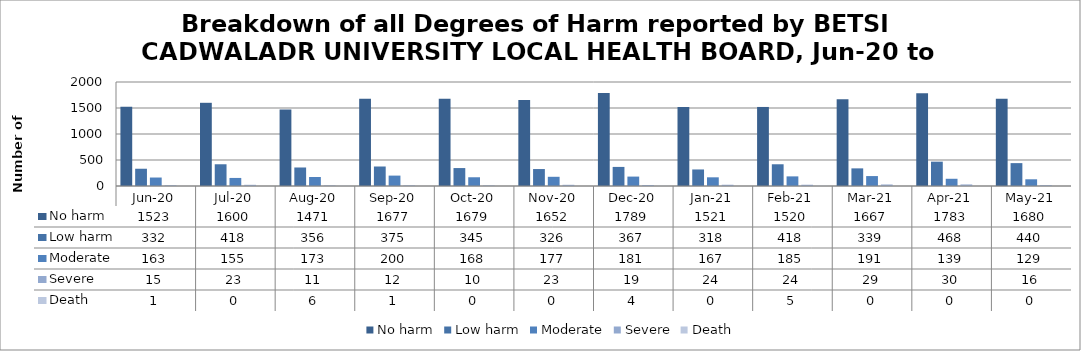
| Category | No harm | Low harm | Moderate | Severe | Death |
|---|---|---|---|---|---|
| Jun-20 | 1523 | 332 | 163 | 15 | 1 |
| Jul-20 | 1600 | 418 | 155 | 23 | 0 |
| Aug-20 | 1471 | 356 | 173 | 11 | 6 |
| Sep-20 | 1677 | 375 | 200 | 12 | 1 |
| Oct-20 | 1679 | 345 | 168 | 10 | 0 |
| Nov-20 | 1652 | 326 | 177 | 23 | 0 |
| Dec-20 | 1789 | 367 | 181 | 19 | 4 |
| Jan-21 | 1521 | 318 | 167 | 24 | 0 |
| Feb-21 | 1520 | 418 | 185 | 24 | 5 |
| Mar-21 | 1667 | 339 | 191 | 29 | 0 |
| Apr-21 | 1783 | 468 | 139 | 30 | 0 |
| May-21 | 1680 | 440 | 129 | 16 | 0 |